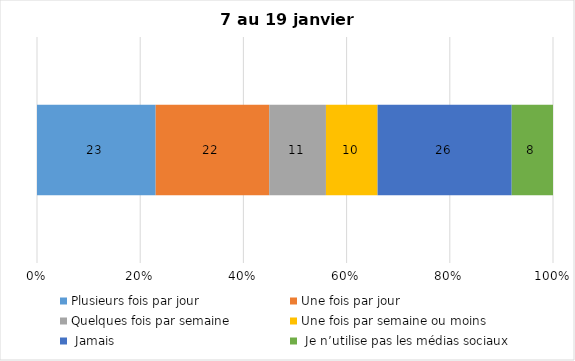
| Category | Plusieurs fois par jour | Une fois par jour | Quelques fois par semaine   | Une fois par semaine ou moins   |  Jamais   |  Je n’utilise pas les médias sociaux |
|---|---|---|---|---|---|---|
| 0 | 23 | 22 | 11 | 10 | 26 | 8 |